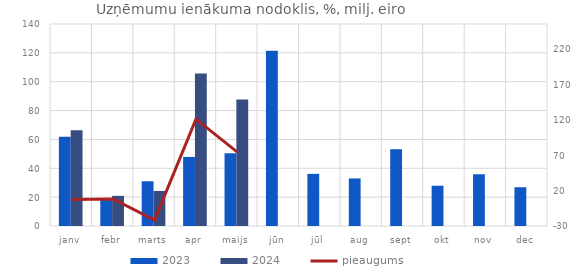
| Category | 2023 | 2024 |
|---|---|---|
| janv | 61.791 | 66.341 |
| febr | 19.323 | 20.888 |
| marts | 31.008 | 24.281 |
| apr | 47.876 | 105.696 |
| maijs | 50.345 | 87.686 |
| jūn | 121.503 | 0 |
| jūl | 36.144 | 0 |
| aug | 32.976 | 0 |
| sept | 53.222 | 0 |
| okt | 27.91 | 0 |
| nov | 35.855 | 0 |
| dec | 26.857 | 0 |